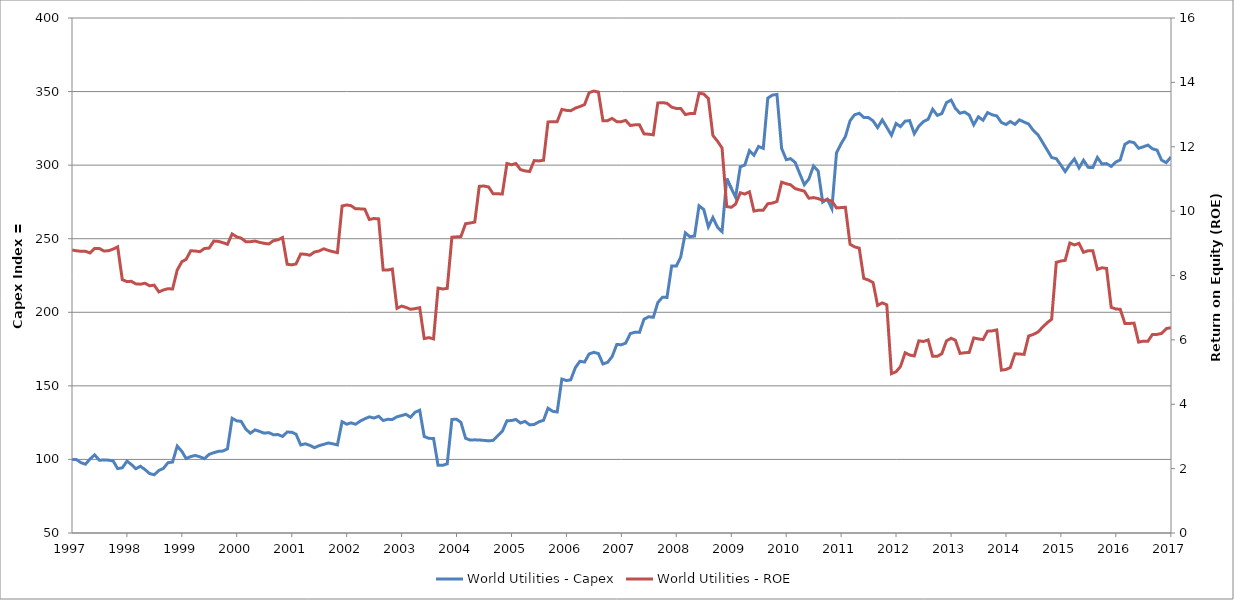
| Category | World Utilities - Capex |
|---|---|
| 1997-02-06 | 100 |
| 1997-03-06 | 99.98 |
| 1997-04-06 | 97.77 |
| 1997-05-06 | 96.76 |
| 1997-06-06 | 100.34 |
| 1997-07-06 | 103.1 |
| 1997-08-06 | 99.51 |
| 1997-09-06 | 99.55 |
| 1997-10-06 | 99.52 |
| 1997-11-06 | 98.94 |
| 1997-12-06 | 93.74 |
| 1998-01-06 | 94.33 |
| 1998-02-06 | 98.86 |
| 1998-03-06 | 96.66 |
| 1998-04-06 | 93.67 |
| 1998-05-06 | 95.35 |
| 1998-06-06 | 93.11 |
| 1998-07-06 | 90.41 |
| 1998-08-06 | 89.57 |
| 1998-09-06 | 92.46 |
| 1998-10-06 | 93.91 |
| 1998-11-06 | 97.81 |
| 1998-12-06 | 98.19 |
| 1999-01-06 | 109.06 |
| 1999-02-06 | 105.43 |
| 1999-03-06 | 100.59 |
| 1999-04-06 | 101.95 |
| 1999-05-06 | 102.72 |
| 1999-06-06 | 101.76 |
| 1999-07-06 | 100.51 |
| 1999-08-06 | 103.45 |
| 1999-09-06 | 104.58 |
| 1999-10-06 | 105.47 |
| 1999-11-06 | 105.71 |
| 1999-12-06 | 107.21 |
| 2000-01-06 | 127.95 |
| 2000-02-06 | 126.21 |
| 2000-03-06 | 125.88 |
| 2000-04-06 | 120.59 |
| 2000-05-06 | 117.81 |
| 2000-06-06 | 120.07 |
| 2000-07-06 | 119.07 |
| 2000-08-06 | 117.86 |
| 2000-09-06 | 118.22 |
| 2000-10-06 | 116.81 |
| 2000-11-06 | 116.88 |
| 2000-12-06 | 115.65 |
| 2001-01-06 | 118.61 |
| 2001-02-06 | 118.48 |
| 2001-03-06 | 117.11 |
| 2001-04-06 | 109.82 |
| 2001-05-06 | 110.64 |
| 2001-06-06 | 109.59 |
| 2001-07-06 | 107.99 |
| 2001-08-06 | 109.34 |
| 2001-09-06 | 110.24 |
| 2001-10-06 | 111.17 |
| 2001-11-06 | 110.61 |
| 2001-12-06 | 109.85 |
| 2002-01-06 | 125.64 |
| 2002-02-06 | 123.95 |
| 2002-03-06 | 124.84 |
| 2002-04-06 | 123.92 |
| 2002-05-06 | 126.01 |
| 2002-06-06 | 127.61 |
| 2002-07-06 | 128.93 |
| 2002-08-06 | 128.12 |
| 2002-09-06 | 129.34 |
| 2002-10-06 | 126.45 |
| 2002-11-06 | 127.25 |
| 2002-12-06 | 127.15 |
| 2003-01-06 | 128.98 |
| 2003-02-06 | 129.81 |
| 2003-03-06 | 130.66 |
| 2003-04-06 | 128.67 |
| 2003-05-06 | 132.04 |
| 2003-06-06 | 133.42 |
| 2003-07-06 | 115.55 |
| 2003-08-06 | 114.32 |
| 2003-09-06 | 114.28 |
| 2003-10-06 | 95.99 |
| 2003-11-06 | 96 |
| 2003-12-06 | 97 |
| 2004-01-06 | 127.19 |
| 2004-02-06 | 127.29 |
| 2004-03-06 | 125.22 |
| 2004-04-06 | 114.39 |
| 2004-05-06 | 113.17 |
| 2004-06-06 | 113.31 |
| 2004-07-06 | 113.19 |
| 2004-08-06 | 112.95 |
| 2004-09-06 | 112.61 |
| 2004-10-06 | 112.92 |
| 2004-11-06 | 116.16 |
| 2004-12-06 | 119.1 |
| 2005-01-06 | 126.31 |
| 2005-02-06 | 126.4 |
| 2005-03-06 | 127.18 |
| 2005-04-06 | 124.73 |
| 2005-05-06 | 125.88 |
| 2005-06-06 | 123.49 |
| 2005-07-06 | 123.77 |
| 2005-08-06 | 125.52 |
| 2005-09-06 | 126.58 |
| 2005-10-06 | 134.78 |
| 2005-11-06 | 132.71 |
| 2005-12-06 | 132.26 |
| 2006-01-06 | 154.63 |
| 2006-02-06 | 153.59 |
| 2006-03-06 | 154.11 |
| 2006-04-06 | 162.43 |
| 2006-05-06 | 166.7 |
| 2006-06-06 | 166.16 |
| 2006-07-06 | 171.67 |
| 2006-08-06 | 172.79 |
| 2006-09-06 | 171.95 |
| 2006-10-06 | 164.91 |
| 2006-11-06 | 165.98 |
| 2006-12-06 | 169.83 |
| 2007-01-06 | 178.09 |
| 2007-02-06 | 177.97 |
| 2007-03-06 | 179.02 |
| 2007-04-06 | 185.5 |
| 2007-05-06 | 186.44 |
| 2007-06-06 | 186.35 |
| 2007-07-06 | 195.26 |
| 2007-08-06 | 196.96 |
| 2007-09-06 | 196.6 |
| 2007-10-06 | 206.63 |
| 2007-11-06 | 210.24 |
| 2007-12-06 | 210.09 |
| 2008-01-06 | 231.46 |
| 2008-02-06 | 231.38 |
| 2008-03-06 | 237.51 |
| 2008-04-06 | 253.97 |
| 2008-05-06 | 251.36 |
| 2008-06-06 | 251.81 |
| 2008-07-06 | 272.39 |
| 2008-08-06 | 269.92 |
| 2008-09-06 | 258.05 |
| 2008-10-06 | 264.39 |
| 2008-11-06 | 257.75 |
| 2008-12-06 | 254.78 |
| 2009-01-06 | 290.93 |
| 2009-02-06 | 284.1 |
| 2009-03-06 | 278.11 |
| 2009-04-06 | 298.88 |
| 2009-05-06 | 300.04 |
| 2009-06-06 | 309.83 |
| 2009-07-06 | 306.73 |
| 2009-08-06 | 312.71 |
| 2009-09-06 | 311.41 |
| 2009-10-06 | 345.55 |
| 2009-11-06 | 347.63 |
| 2009-12-06 | 348.06 |
| 2010-01-06 | 311.39 |
| 2010-02-06 | 303.69 |
| 2010-03-06 | 304.41 |
| 2010-04-06 | 301.84 |
| 2010-05-06 | 294.33 |
| 2010-06-06 | 286.69 |
| 2010-07-06 | 290.56 |
| 2010-08-06 | 299.41 |
| 2010-09-06 | 295.96 |
| 2010-10-06 | 274.89 |
| 2010-11-06 | 276.9 |
| 2010-12-06 | 270.43 |
| 2011-01-06 | 308.41 |
| 2011-02-06 | 314.68 |
| 2011-03-06 | 319.45 |
| 2011-04-06 | 330.2 |
| 2011-05-06 | 334.22 |
| 2011-06-06 | 335.24 |
| 2011-07-06 | 332.46 |
| 2011-08-06 | 332.37 |
| 2011-09-06 | 330.07 |
| 2011-10-06 | 325.5 |
| 2011-11-06 | 330.76 |
| 2011-12-06 | 325.7 |
| 2012-01-06 | 320.34 |
| 2012-02-06 | 328.32 |
| 2012-03-06 | 326.17 |
| 2012-04-06 | 329.9 |
| 2012-05-06 | 330.28 |
| 2012-06-06 | 321.38 |
| 2012-07-06 | 326.48 |
| 2012-08-06 | 329.64 |
| 2012-09-06 | 331.19 |
| 2012-10-06 | 337.98 |
| 2012-11-06 | 333.85 |
| 2012-12-06 | 335.06 |
| 2013-01-06 | 342.5 |
| 2013-02-06 | 344.22 |
| 2013-03-06 | 338.58 |
| 2013-04-06 | 335.27 |
| 2013-05-06 | 336.11 |
| 2013-06-06 | 334.05 |
| 2013-07-06 | 327.41 |
| 2013-08-06 | 332.85 |
| 2013-09-06 | 330.52 |
| 2013-10-06 | 335.71 |
| 2013-11-06 | 334.2 |
| 2013-12-06 | 333.49 |
| 2014-01-06 | 329.01 |
| 2014-02-06 | 327.6 |
| 2014-03-06 | 329.67 |
| 2014-04-06 | 327.73 |
| 2014-05-06 | 330.76 |
| 2014-06-06 | 329.27 |
| 2014-07-06 | 327.96 |
| 2014-08-06 | 323.61 |
| 2014-09-06 | 320.63 |
| 2014-10-06 | 315.65 |
| 2014-11-06 | 310.36 |
| 2014-12-06 | 305.2 |
| 2015-01-06 | 304.39 |
| 2015-02-06 | 299.92 |
| 2015-03-06 | 295.66 |
| 2015-04-06 | 300.44 |
| 2015-05-06 | 304.18 |
| 2015-06-06 | 298.13 |
| 2015-07-06 | 303.32 |
| 2015-08-06 | 298.49 |
| 2015-09-06 | 298.43 |
| 2015-10-06 | 305.21 |
| 2015-11-06 | 300.78 |
| 2015-12-06 | 301.06 |
| 2016-01-06 | 299.12 |
| 2016-02-06 | 302.12 |
| 2016-03-06 | 303.56 |
| 2016-04-06 | 314.14 |
| 2016-05-06 | 316.01 |
| 2016-06-06 | 315.28 |
| 2016-07-06 | 311.47 |
| 2016-08-06 | 312.43 |
| 2016-09-06 | 313.64 |
| 2016-10-06 | 311.11 |
| 2016-11-06 | 310.2 |
| 2016-12-06 | 303.39 |
| 2017-01-06 | 301.75 |
| 2017-02-06 | 305.51 |